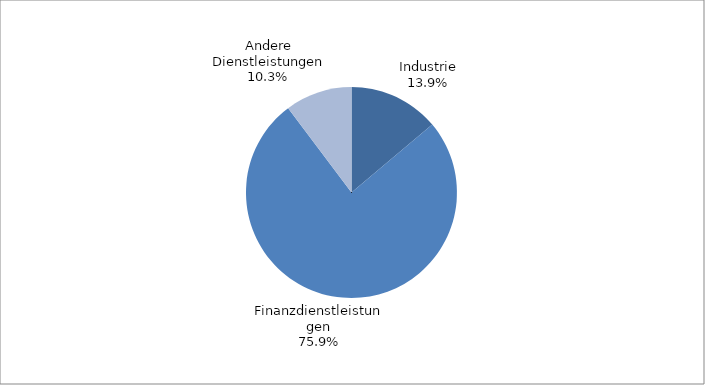
| Category | Series 0 |
|---|---|
| Industrie | 0.138 |
| Finanzdienstleistungen | 0.755 |
| Andere Dienstleistungen | 0.102 |